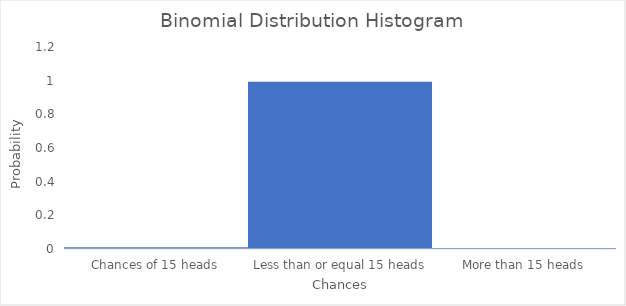
| Category | Series 0 |
|---|---|
| Chances of 15 heads | 0.011 |
| Less than or equal 15 heads | 0.994 |
| More than 15 heads | 0.006 |